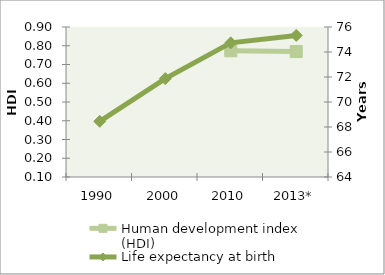
| Category | Human development index (HDI) |
|---|---|
| 1990 | 0 |
| 2000 | 0 |
| 2010 | 0.773 |
| 2013* | 0.769 |